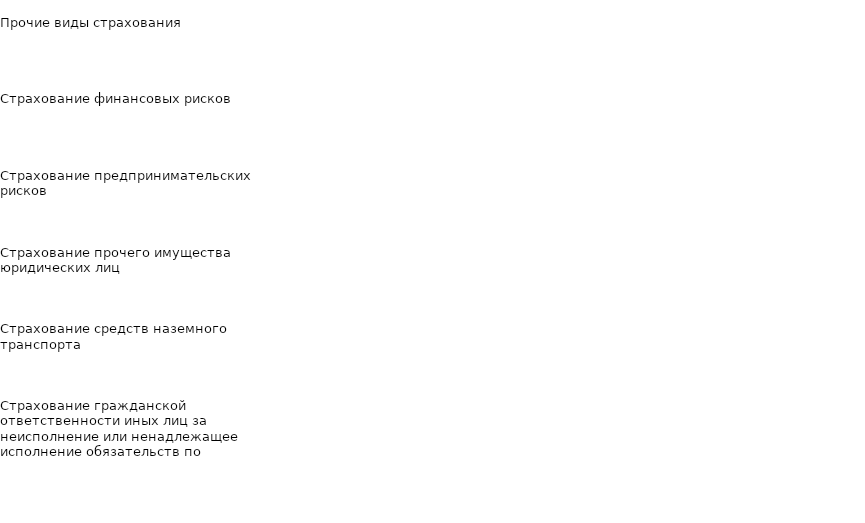
| Category | Страхование грузов | Страхование гражданской ответственности иных лиц за неисполнение или ненадлежащее исполнение обязательств по договору | Страхование средств наземного транспорта | Страхование прочего имущества юридических лиц | Страхование предпринимательских рисков | Страхование финансовых рисков | Прочие виды страхования |
|---|---|---|---|---|---|---|---|
| 2013.0 | 0 | 0.113 | 0.113 | 0.478 | 0 | 0 | 0.296 |
| 2014.0 | 0 | 0.925 | 0.006 | 0.038 | 0 | 0.022 | 0.007 |
| 2015.0 | 0 | 0.943 | 0.004 | 0.016 | 0.012 | 0.011 | 0.014 |
| 2016.0 | 0 | 0.986 | 0.001 | 0.005 | 0 | 0.004 | 0.004 |
| 2017.0 | 0 | 0.982 | 0.001 | 0.005 | 0 | 0.005 | 0.006 |
| 2018.0 | 0 | 0.941 | 0.004 | 0.009 | 0.027 | 0.011 | 0.008 |
| 2019.0 | 0.018 | 0.565 | 0.242 | 0.07 | 0.008 | 0.045 | 0.053 |
| 2020.0 | 0.056 | 0.27 | 0.382 | 0.083 | 0.121 | 0.042 | 0.046 |
| 2021.0 | 0.635 | 0.136 | 0.125 | 0.075 | 0.004 | 0.01 | 0.015 |